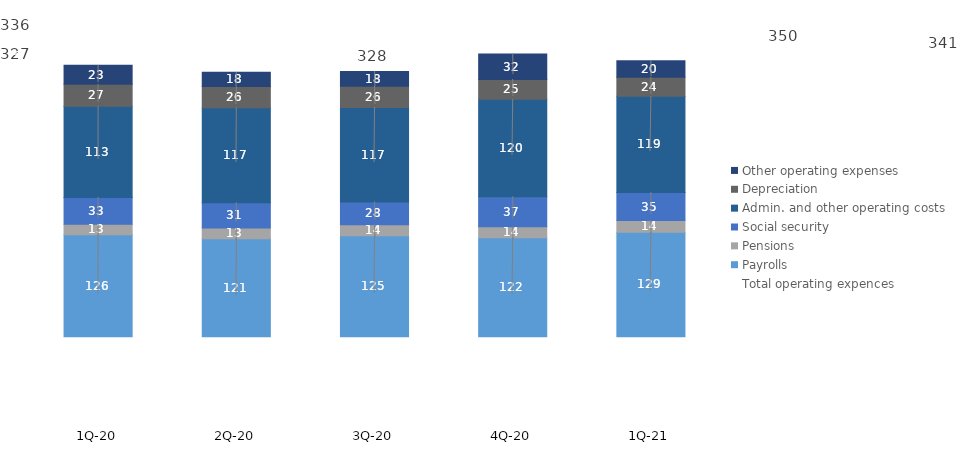
| Category | Payrolls | Pensions | Social security | Admin. and other operating costs | Depreciation | Other operating expenses |
|---|---|---|---|---|---|---|
| 1Q-21 | 129.226 | 14.478 | 34.637 | 119.105 | 23.716 | 20.338 |
| 4Q-20 | 122.325 | 13.853 | 37.12 | 120.434 | 24.617 | 31.658 |
| 3Q-20 | 124.922 | 13.51 | 28.236 | 117.066 | 26.116 | 18.311 |
| 2Q-20 | 121.292 | 13.37 | 31.266 | 117.403 | 26.314 | 17.514 |
| 1Q-20 | 126.236 | 12.924 | 33.263 | 112.75 | 27.262 | 23.365 |